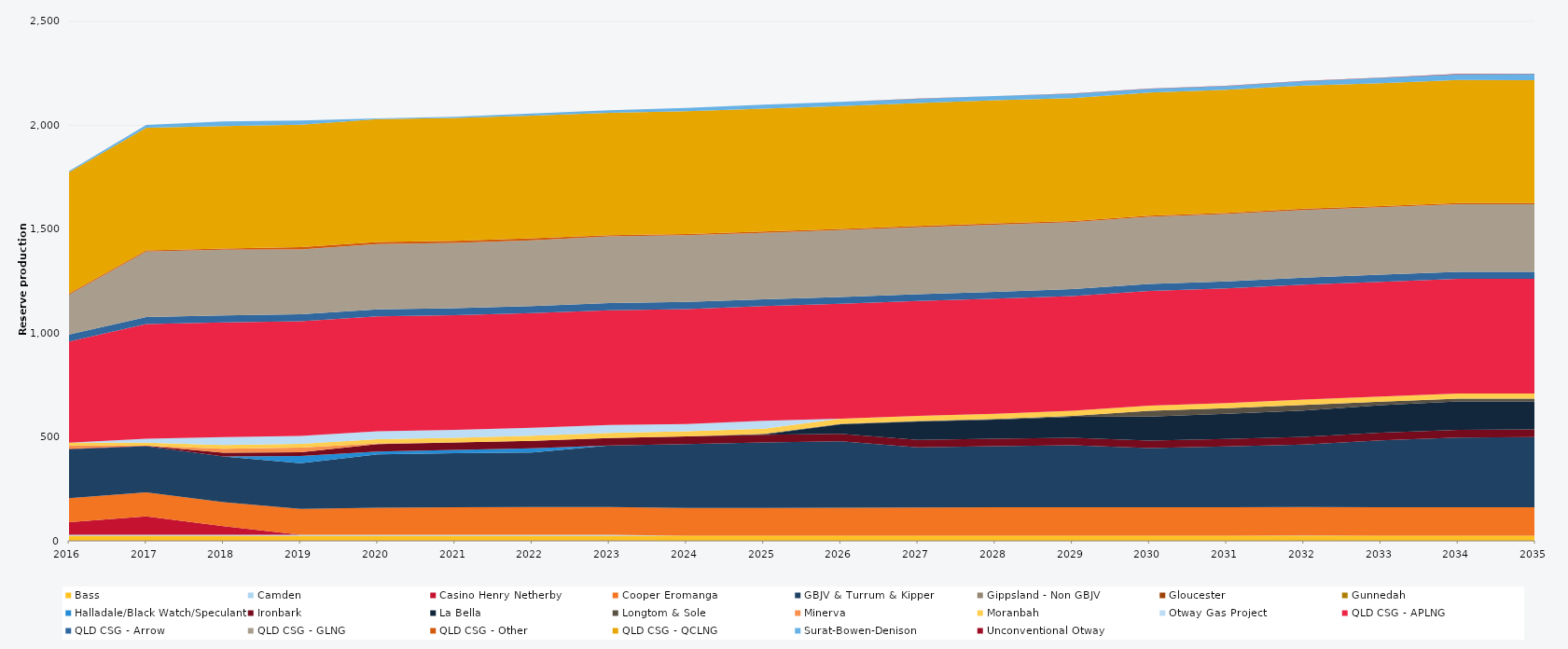
| Category | Bass | Camden | Casino Henry Netherby | Cooper Eromanga | GBJV & Turrum & Kipper | Gippsland - Non GBJV | Gloucester | Gunnedah | Halladale/Black Watch/Speculant | Ironbark | La Bella | Longtom & Sole | Minerva | Moranbah | Otway Gas Project | QLD CSG - APLNG | QLD CSG - Arrow | QLD CSG - GLNG | QLD CSG - Other | QLD CSG - QCLNG | Surat-Bowen-Denison | Unconventional Otway |
|---|---|---|---|---|---|---|---|---|---|---|---|---|---|---|---|---|---|---|---|---|---|---|
| 2016 | 24.522 | 5 | 60.472 | 115.657 | 235.041 | 0 | 0 | 0 | 0 | 2.597 | 0 | 0 | 16 | 13.152 | 0 | 486.488 | 34.038 | 192.101 | 5.856 | 582.654 | 5.618 | 0 |
| 2017 | 24.455 | 5 | 88.438 | 115.039 | 222.562 | 0 | 0 | 0 | 0 | 2.005 | 0 | 0 | 0 | 14.795 | 19.039 | 552.245 | 33.945 | 315.22 | 5.84 | 589.586 | 13.591 | 0 |
| 2018 | 24.455 | 5 | 41.35 | 115.271 | 220 | 0 | 0 | 0 | 0 | 18.088 | 0 | 0 | 18.735 | 17.982 | 38 | 552.245 | 33.945 | 316.326 | 5.84 | 588.729 | 23.147 | 0 |
| 2019 | 24.455 | 5 | 0 | 124.598 | 220 | 0 | 0 | 0 | 33.919 | 18.25 | 0 | 0 | 22.558 | 18.049 | 38 | 552.245 | 33.945 | 312.025 | 10.403 | 588.925 | 20.234 | 0 |
| 2020 | 24.522 | 5 | 0 | 129.894 | 257.268 | 0 | 0 | 0 | 12.525 | 36.6 | 0 | 0 | 3.457 | 19.619 | 38 | 553.758 | 34.038 | 313.213 | 10.419 | 591.05 | 4.226 | 0 |
| 2021 | 24.455 | 5 | 0 | 132.006 | 260.193 | 0 | 0 | 0 | 15.563 | 36.5 | 0 | 0 | 0 | 22.179 | 38 | 552.245 | 33.945 | 314.192 | 10.403 | 590.232 | 5.797 | 0 |
| 2022 | 24.455 | 5 | 0 | 133.177 | 262.597 | 0 | 0 | 0 | 19.992 | 36.5 | 0 | 0 | 0 | 24.141 | 38 | 552.245 | 33.945 | 315.787 | 10.403 | 590.248 | 9.743 | 0 |
| 2023 | 24.455 | 5 | 0 | 133.46 | 295.789 | 0 | 0 | 0 | 0 | 36.5 | 0 | 0 | 0 | 24.787 | 38 | 552.245 | 33.945 | 320.755 | 5.84 | 589.906 | 12.038 | 0 |
| 2024 | 24.522 | 0 | 0 | 133.338 | 307.965 | 0 | 0 | 0 | 0 | 36.6 | 0 | 0 | 0 | 24.888 | 34.567 | 553.758 | 34.038 | 321.248 | 5.856 | 591.549 | 14.999 | 0 |
| 2025 | 24.455 | 0 | 0 | 134.094 | 315.053 | 0 | 0 | 0 | 0 | 36.5 | 2.075 | 2.367 | 0 | 24.82 | 38 | 552.245 | 32.343 | 320.874 | 5.84 | 591.798 | 18.8 | 0 |
| 2026 | 24.455 | 0 | 0 | 134.465 | 320.115 | 0 | 0 | 0 | 0 | 36.5 | 45.371 | 2.723 | 0 | 24.82 | 0 | 552.245 | 32.763 | 321.752 | 5.84 | 591.755 | 19.836 | 0.385 |
| 2027 | 24.455 | 0 | 0 | 135.856 | 289.153 | 0 | 0 | 0 | 0 | 36.5 | 88.148 | 3.032 | 0 | 24.82 | 0 | 552.245 | 33.063 | 322.387 | 5.84 | 591.711 | 19.89 | 1.256 |
| 2028 | 24.522 | 0 | 0 | 136.649 | 293.862 | 0 | 0 | 0 | 0 | 36.6 | 91.715 | 3.398 | 0 | 24.888 | 0 | 553.758 | 33.212 | 323.327 | 5.856 | 593.257 | 19.502 | 0.879 |
| 2029 | 24.455 | 0 | 0 | 136.729 | 298.821 | 0 | 0 | 0 | 0 | 36.5 | 100.818 | 3.565 | 0 | 24.82 | 0 | 552.245 | 33.341 | 322.623 | 5.84 | 591.623 | 21.014 | 0.505 |
| 2030 | 24.455 | 0 | 0 | 136.875 | 285.075 | 0 | 0 | 0 | 0 | 36.5 | 115.597 | 27.375 | 0 | 24.82 | 0 | 552.245 | 33.547 | 323.488 | 5.84 | 591.579 | 18.425 | 1.338 |
| 2031 | 24.455 | 0 | 0 | 136.875 | 292.883 | 0 | 0 | 0 | 0 | 36.5 | 120.538 | 27.375 | 0 | 24.82 | 0 | 552.245 | 33.698 | 324.048 | 5.84 | 591.535 | 18.304 | 1.143 |
| 2032 | 24.522 | 0.913 | 0 | 137.25 | 300.923 | 0 | 0 | 0 | 0 | 36.6 | 126.955 | 27.45 | 0 | 24.888 | 0 | 553.758 | 33.929 | 325.401 | 5.856 | 593.081 | 21.103 | 1.205 |
| 2033 | 24.455 | 0.087 | 0 | 136.875 | 322.3 | 0 | 0 | 0 | 0 | 36.5 | 133.322 | 16.388 | 0 | 24.82 | 0 | 552.245 | 33.887 | 324.946 | 5.84 | 591.447 | 25.192 | 1.081 |
| 2034 | 24.455 | 0 | 0 | 136.875 | 336.242 | 0 | 0 | 0 | 0 | 36.5 | 136.483 | 13.79 | 0 | 24.82 | 0 | 552.245 | 33.906 | 325.249 | 5.84 | 591.403 | 28.012 | 1.64 |
| 2035 | 24.455 | 0 | 0 | 136.875 | 338.546 | 0 | 0 | 0 | 0 | 36.5 | 135.081 | 12.6 | 0 | 24.82 | 0 | 552.245 | 33.923 | 325.176 | 5.84 | 591.053 | 30.045 | 1.568 |